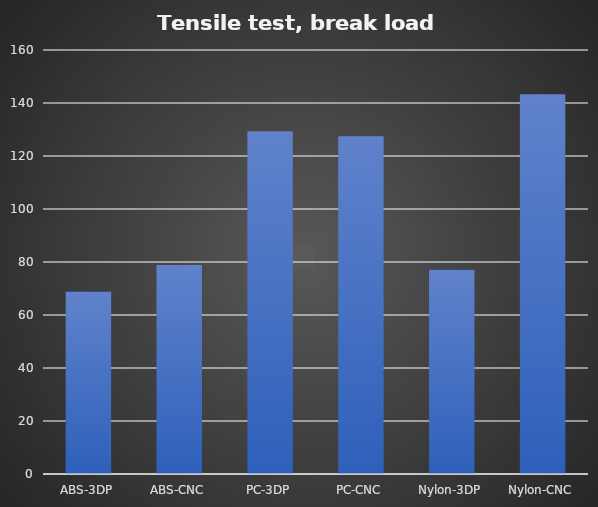
| Category | Average (kg) |
|---|---|
| ABS-3DP | 68.85 |
| ABS-CNC | 78.9 |
| PC-3DP | 129.3 |
| PC-CNC | 127.45 |
| Nylon-3DP | 77.05 |
| Nylon-CNC | 143.3 |